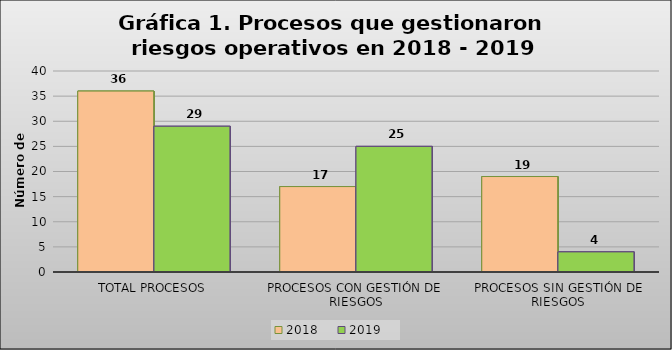
| Category | 2018 | 2019 |
|---|---|---|
| TOTAL PROCESOS | 36 | 29 |
| PROCESOS CON GESTIÓN DE  RIESGOS | 17 | 25 |
| PROCESOS SIN GESTIÓN DE RIESGOS | 19 | 4 |